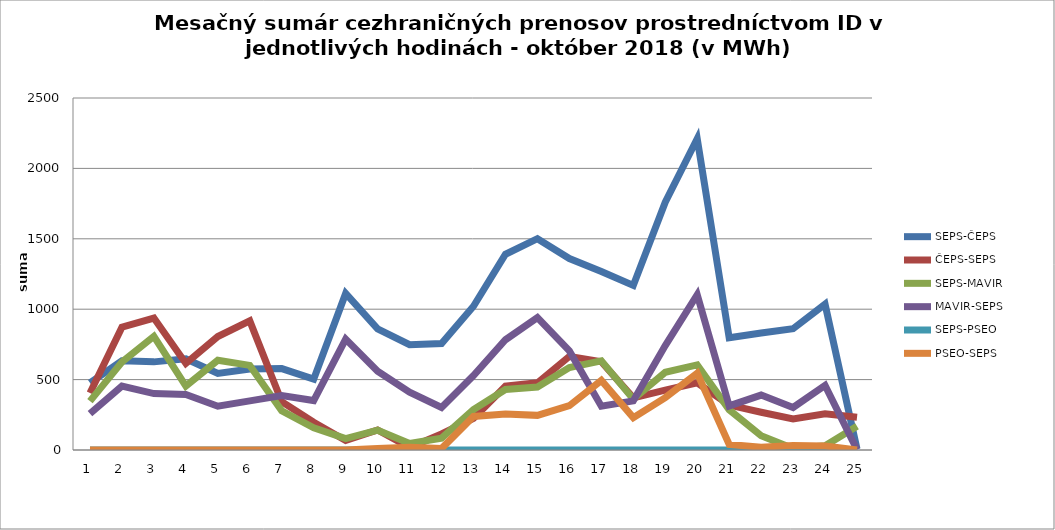
| Category | SEPS-ČEPS | ČEPS-SEPS | SEPS-MAVIR | MAVIR-SEPS | SEPS-PSEO | PSEO-SEPS |
|---|---|---|---|---|---|---|
| 1.0 | 476 | 405 | 347 | 258 | 0 | 0 |
| 2.0 | 633 | 872 | 625 | 454 | 0 | 0 |
| 3.0 | 626 | 937 | 807 | 401 | 0 | 0 |
| 4.0 | 648 | 615 | 454 | 395 | 0 | 0 |
| 5.0 | 544 | 806 | 637 | 311 | 0 | 0 |
| 6.0 | 575 | 917 | 601 | 349 | 0 | 0 |
| 7.0 | 578 | 343 | 279 | 386 | 0 | 0 |
| 8.0 | 503 | 197 | 157 | 351 | 0 | 0 |
| 9.0 | 1112 | 68 | 81 | 788 | 0 | 0 |
| 10.0 | 860 | 142 | 141 | 559 | 0 | 10 |
| 11.0 | 748 | 18 | 47 | 411 | 0 | 20 |
| 12.0 | 756 | 114 | 84 | 302 | 0 | 10 |
| 13.0 | 1021 | 224 | 287 | 529 | 0 | 238 |
| 14.0 | 1390 | 453 | 430 | 783 | 0 | 255 |
| 15.0 | 1501 | 477 | 447 | 941 | 0 | 246 |
| 16.0 | 1360 | 665 | 585 | 704 | 0 | 315 |
| 17.0 | 1268 | 627 | 633 | 311 | 0 | 494 |
| 18.0 | 1169 | 370 | 361 | 349 | 0 | 230 |
| 19.0 | 1760 | 425 | 552 | 742 | 0 | 372 |
| 20.0 | 2211 | 477 | 604 | 1103 | 0 | 545 |
| 21.0 | 797 | 319 | 286 | 313 | 0 | 39 |
| 22.0 | 831 | 268 | 102 | 390 | 0 | 20 |
| 23.0 | 861 | 220 | 11 | 302 | 0 | 32 |
| 24.0 | 1036 | 258 | 30 | 459 | 0 | 29 |
| 25.0 | 7 | 233 | 168 | 2 | 0 | 0 |